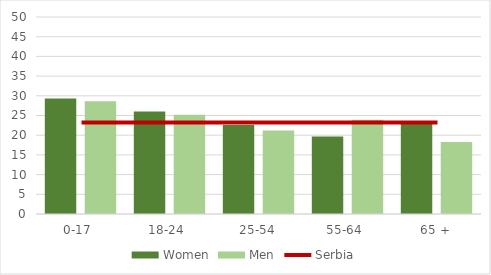
| Category | Women | Men |
|---|---|---|
| 0-17  | 29.3 | 28.6 |
| 18-24  | 26 | 25.2 |
| 25-54 | 22.6 | 21.2 |
| 55-64  | 19.7 | 23.9 |
| 65 + | 23.2 | 18.3 |